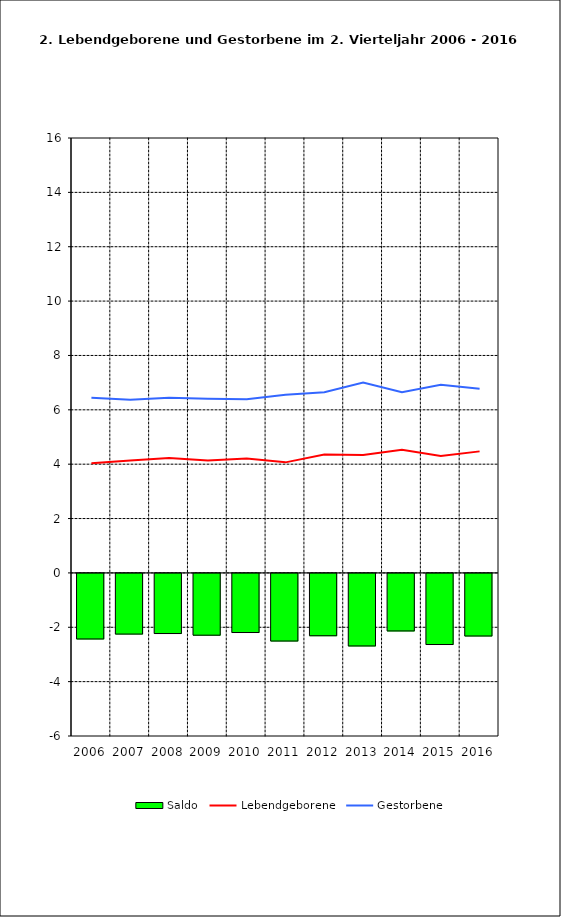
| Category | Saldo |
|---|---|
| 2005.0 | -2.412 |
| 2006.0 | -2.232 |
| 2007.0 | -2.212 |
| 2008.0 | -2.273 |
| 2009.0 | -2.175 |
| 2010.0 | -2.488 |
| 2011.0 | -2.293 |
| 2012.0 | -2.669 |
| 2013.0 | -2.117 |
| 2014.0 | -2.616 |
| 2015.0 | -2.303 |